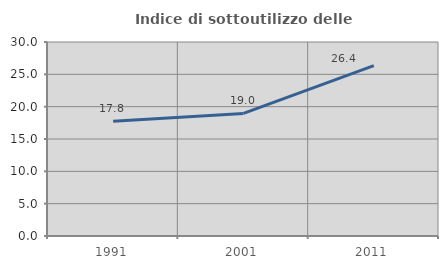
| Category | Indice di sottoutilizzo delle abitazioni  |
|---|---|
| 1991.0 | 17.762 |
| 2001.0 | 18.952 |
| 2011.0 | 26.355 |